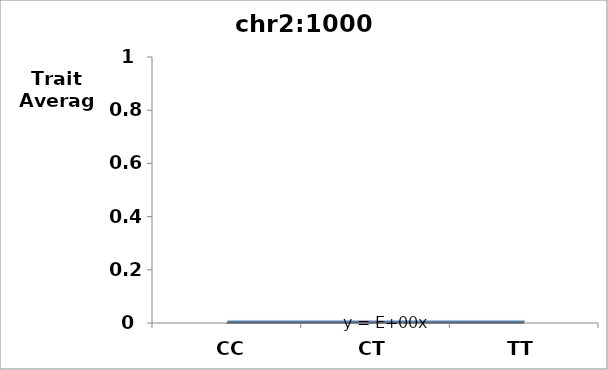
| Category | Score |
|---|---|
| CC | 0 |
| CT | 0 |
| TT | 0 |